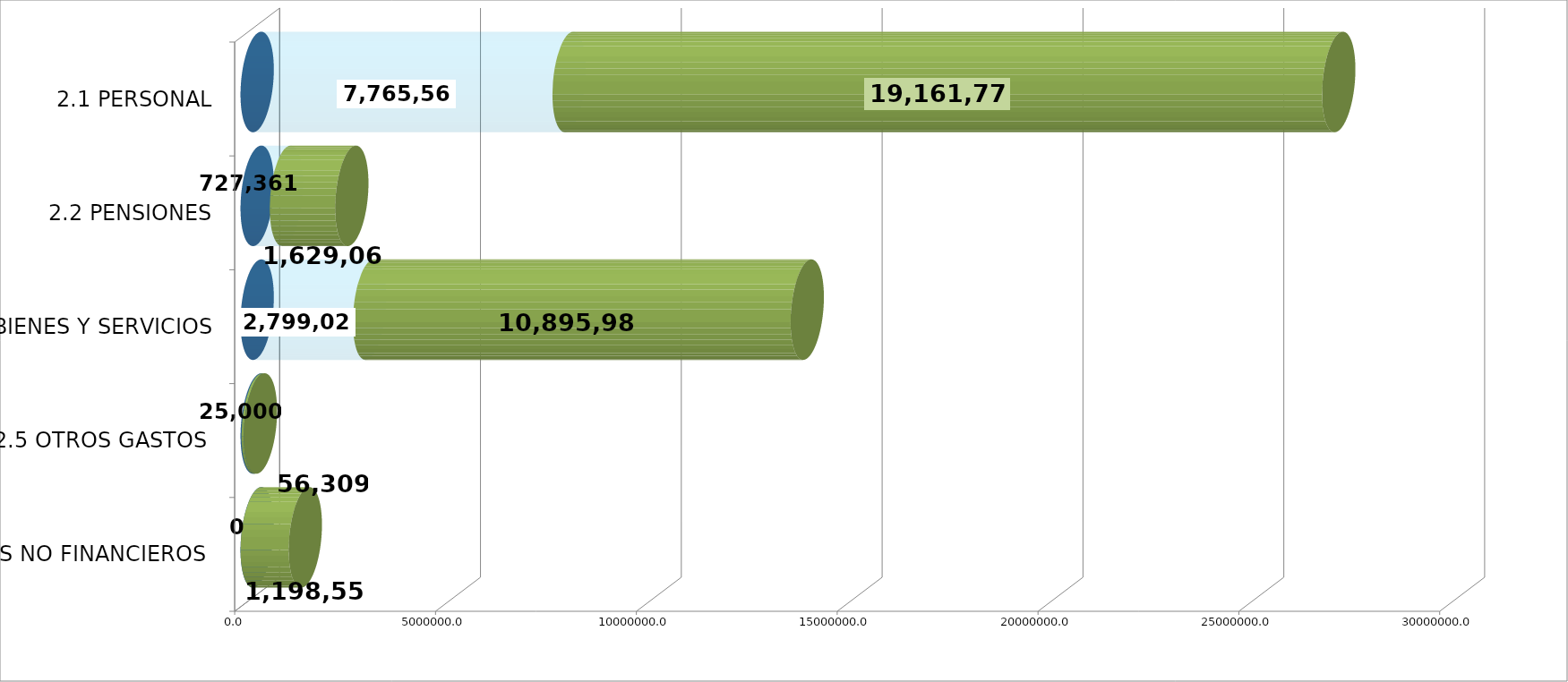
| Category | GENERICA | EJECUTADO | SALDO  |
|---|---|---|---|
| 2.1 PERSONAL | 0 | 7765559.64 | 19161773.36 |
| 2.2 PENSIONES | 0 | 727361.44 | 1629060.56 |
| 2.3 BIENES Y SERVICIOS | 0 | 2799022.9 | 10895983.1 |
| 2.5 OTROS GASTOS  | 0 | 25000 | 56309 |
| 2.6 ACTIVOS NO FINANCIEROS  | 0 | 0 | 1198556 |